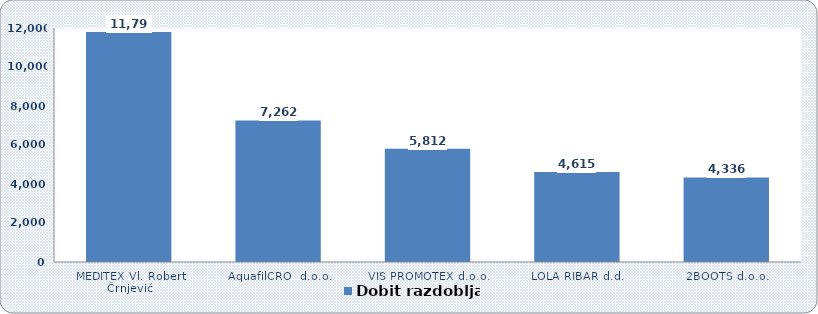
| Category | Dobit razdoblja |
|---|---|
| MEDITEX Vl. Robert Črnjević | 11790 |
| AquafilCRO  d.o.o. | 7262 |
| VIS PROMOTEX d.o.o. | 5812 |
| LOLA RIBAR d.d. | 4615 |
| 2BOOTS d.o.o. | 4336 |